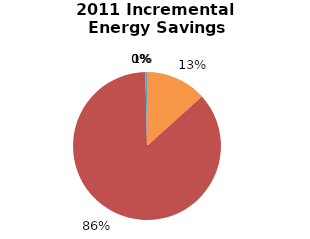
| Category | Incremental Energy Savings (kWh) |
|---|---|
| Consumer Program Total | 95588.552 |
| Business Program Total | 619626.928 |
| Industrial Program Total | 103.985 |
| Home Assistance Program Total | 0 |
| Pre-2011 Programs completed in 2011 Total | 2398.49 |